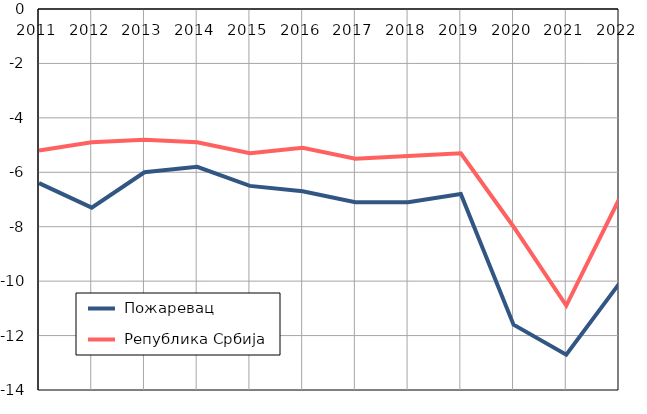
| Category |  Пожаревац |  Република Србија |
|---|---|---|
| 2011.0 | -6.4 | -5.2 |
| 2012.0 | -7.3 | -4.9 |
| 2013.0 | -6 | -4.8 |
| 2014.0 | -5.8 | -4.9 |
| 2015.0 | -6.5 | -5.3 |
| 2016.0 | -6.7 | -5.1 |
| 2017.0 | -7.1 | -5.5 |
| 2018.0 | -7.1 | -5.4 |
| 2019.0 | -6.8 | -5.3 |
| 2020.0 | -11.6 | -8 |
| 2021.0 | -12.7 | -10.9 |
| 2022.0 | -10.1 | -7 |